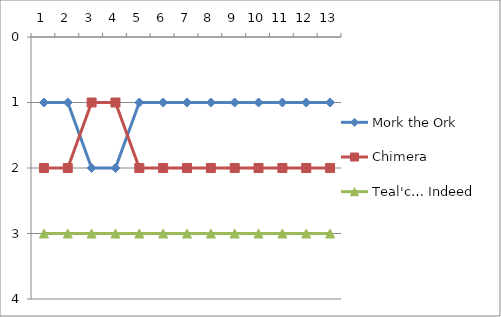
| Category | Mork the Ork | Chimera | Teal'c… Indeed |
|---|---|---|---|
| 0 | 1 | 2 | 3 |
| 1 | 1 | 2 | 3 |
| 2 | 2 | 1 | 3 |
| 3 | 2 | 1 | 3 |
| 4 | 1 | 2 | 3 |
| 5 | 1 | 2 | 3 |
| 6 | 1 | 2 | 3 |
| 7 | 1 | 2 | 3 |
| 8 | 1 | 2 | 3 |
| 9 | 1 | 2 | 3 |
| 10 | 1 | 2 | 3 |
| 11 | 1 | 2 | 3 |
| 12 | 1 | 2 | 3 |